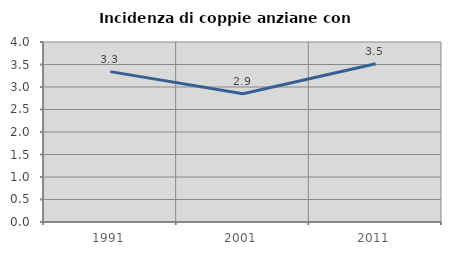
| Category | Incidenza di coppie anziane con figli |
|---|---|
| 1991.0 | 3.342 |
| 2001.0 | 2.851 |
| 2011.0 | 3.516 |